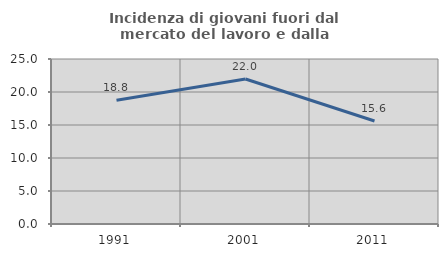
| Category | Incidenza di giovani fuori dal mercato del lavoro e dalla formazione  |
|---|---|
| 1991.0 | 18.765 |
| 2001.0 | 21.968 |
| 2011.0 | 15.611 |